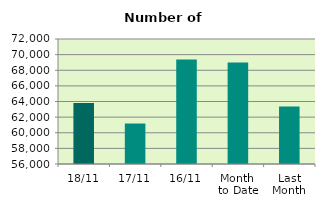
| Category | Series 0 |
|---|---|
| 18/11 | 63812 |
| 17/11 | 61182 |
| 16/11 | 69364 |
| Month 
to Date | 68997 |
| Last
Month | 63348.667 |